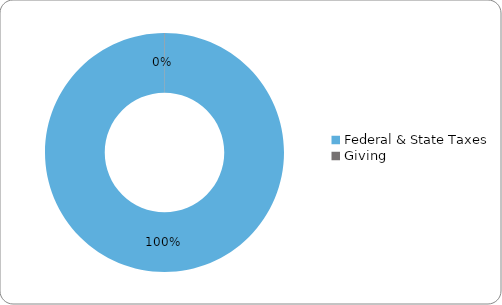
| Category | Series 0 |
|---|---|
| Federal & State Taxes | 7500 |
| Giving | 5 |